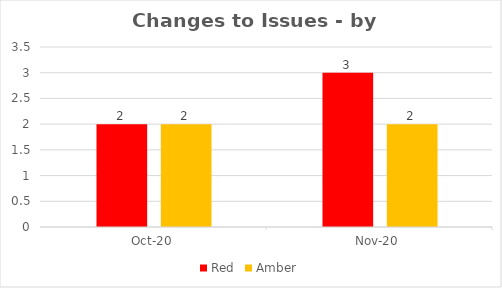
| Category | Red | Amber |
|---|---|---|
| 2020-10-01 | 2 | 2 |
| 2020-11-01 | 3 | 2 |